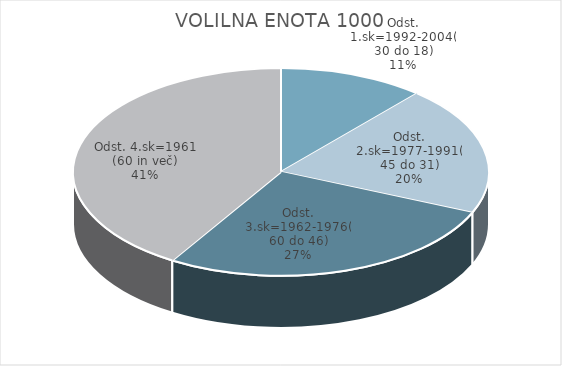
| Category | VOLILNA ENOTA 1000 |
|---|---|
| Odst. 1.sk=1992-2004(30 do 18) | 6.14 |
| Odst. 2.sk=1977-1991(45 do 31) | 10.86 |
| Odst. 3.sk=1962-1976(60 do 46) | 14.77 |
| Odst. 4.sk=1961 (60 in več) | 22.31 |